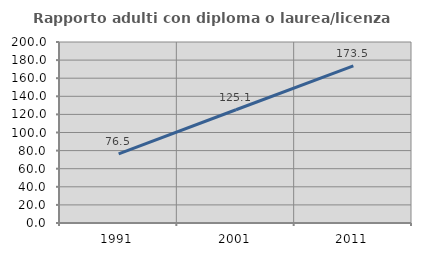
| Category | Rapporto adulti con diploma o laurea/licenza media  |
|---|---|
| 1991.0 | 76.473 |
| 2001.0 | 125.108 |
| 2011.0 | 173.546 |